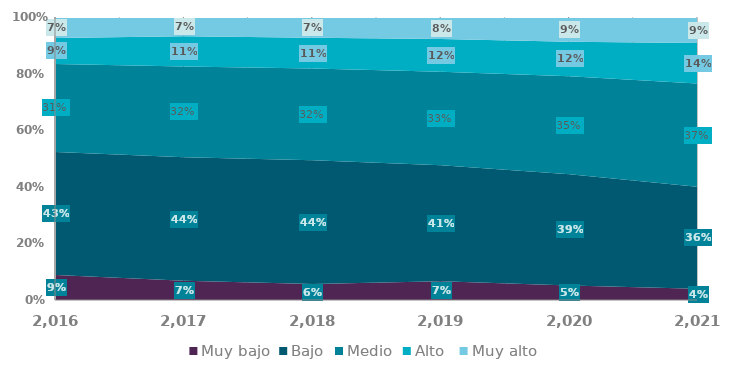
| Category | Muy bajo | Bajo | Medio | Alto  | Muy alto |
|---|---|---|---|---|---|
| 2016.0 | 0.088 | 0.435 | 0.311 | 0.092 | 0.074 |
| 2017.0 | 0.068 | 0.436 | 0.321 | 0.107 | 0.068 |
| 2018.0 | 0.056 | 0.438 | 0.324 | 0.109 | 0.073 |
| 2019.0 | 0.066 | 0.41 | 0.33 | 0.116 | 0.078 |
| 2020.0 | 0.052 | 0.393 | 0.347 | 0.122 | 0.087 |
| 2021.0 | 0.039 | 0.36 | 0.365 | 0.143 | 0.092 |